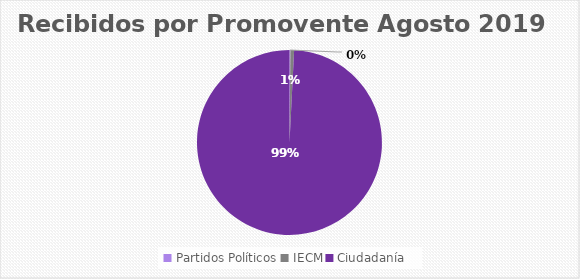
| Category | Recibidos por Promovente AGOSTO |
|---|---|
| Partidos Políticos | 1 |
| IECM | 4 |
| Ciudadanía  | 620 |